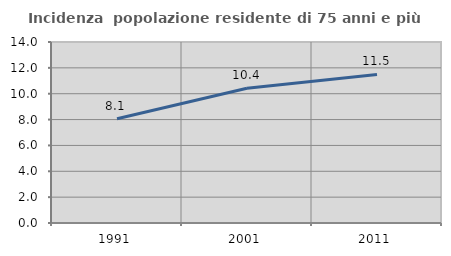
| Category | Incidenza  popolazione residente di 75 anni e più |
|---|---|
| 1991.0 | 8.06 |
| 2001.0 | 10.417 |
| 2011.0 | 11.488 |